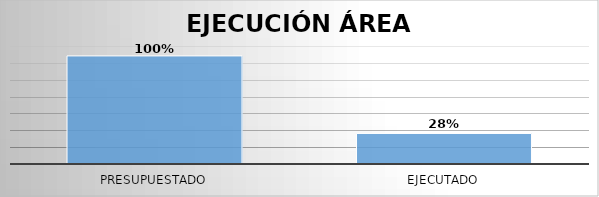
| Category | Series 0 |
|---|---|
| Presupuestado | 6412001291 |
| Ejecutado | 1811382159 |